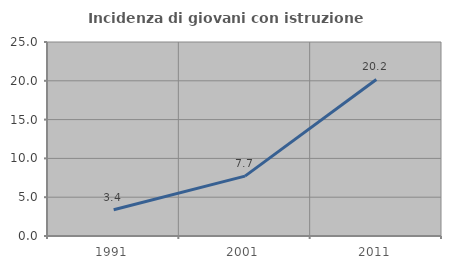
| Category | Incidenza di giovani con istruzione universitaria |
|---|---|
| 1991.0 | 3.39 |
| 2001.0 | 7.721 |
| 2011.0 | 20.175 |